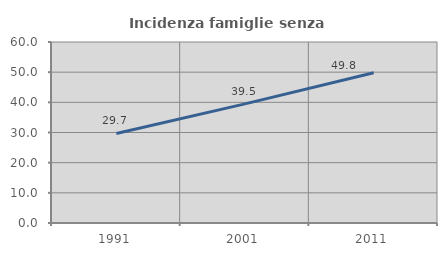
| Category | Incidenza famiglie senza nuclei |
|---|---|
| 1991.0 | 29.67 |
| 2001.0 | 39.483 |
| 2011.0 | 49.789 |